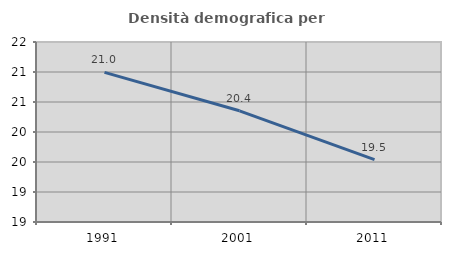
| Category | Densità demografica |
|---|---|
| 1991.0 | 20.994 |
| 2001.0 | 20.353 |
| 2011.0 | 19.54 |